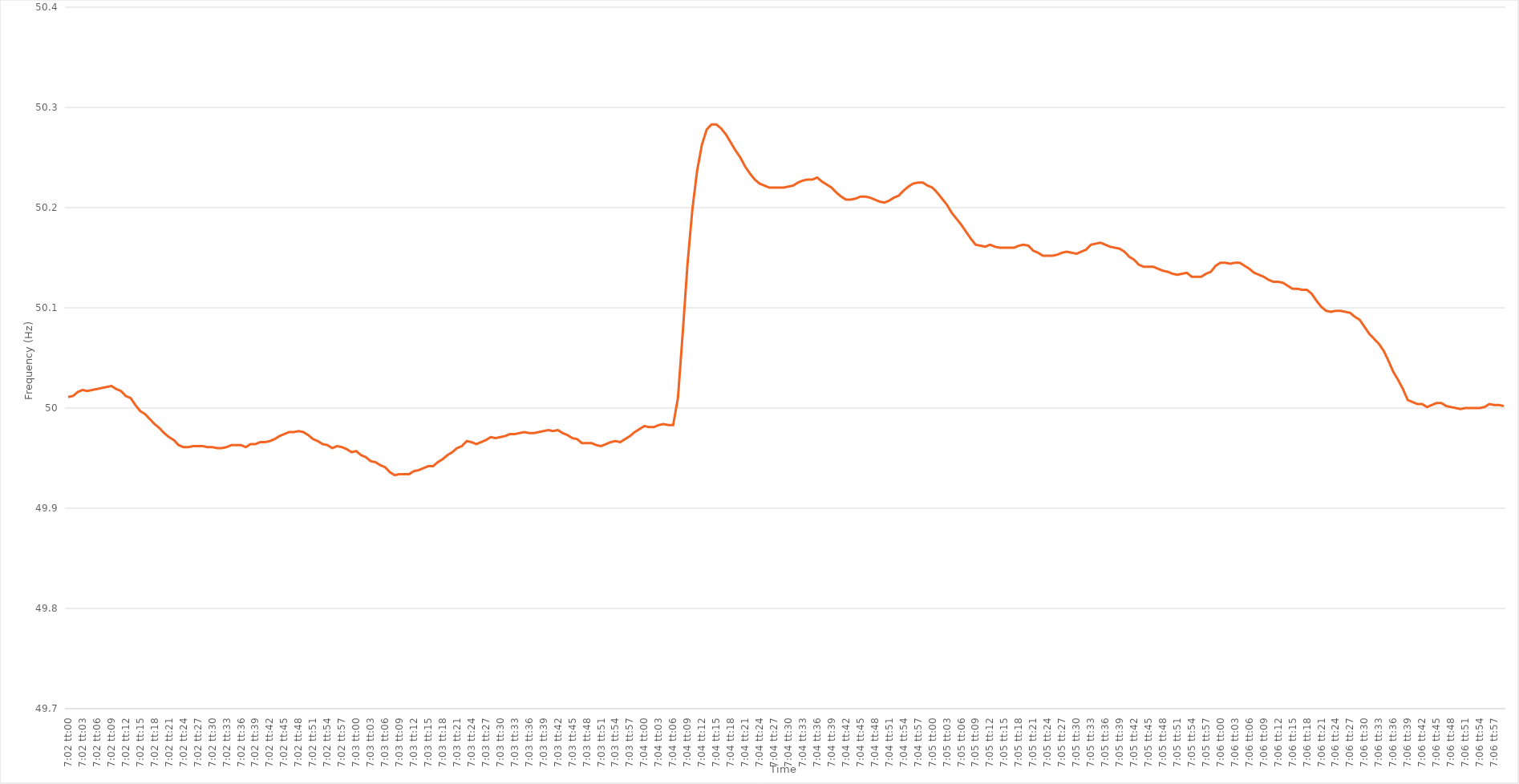
| Category | Series 0 |
|---|---|
| 0.29305555555555557 | 50.011 |
| 0.2930671296296296 | 50.012 |
| 0.2930787037037037 | 50.016 |
| 0.2930902777777778 | 50.018 |
| 0.29310185185185184 | 50.017 |
| 0.29311342592592593 | 50.018 |
| 0.293125 | 50.019 |
| 0.29313657407407406 | 50.02 |
| 0.29314814814814816 | 50.021 |
| 0.29315972222222225 | 50.022 |
| 0.2931712962962963 | 50.019 |
| 0.2931828703703704 | 50.017 |
| 0.2931944444444445 | 50.012 |
| 0.2932060185185185 | 50.01 |
| 0.29321759259259256 | 50.003 |
| 0.29322916666666665 | 49.997 |
| 0.29324074074074075 | 49.994 |
| 0.2932523148148148 | 49.989 |
| 0.2932638888888889 | 49.984 |
| 0.293275462962963 | 49.98 |
| 0.293287037037037 | 49.975 |
| 0.2932986111111111 | 49.971 |
| 0.2933101851851852 | 49.968 |
| 0.29332175925925924 | 49.963 |
| 0.29333333333333333 | 49.961 |
| 0.29334490740740743 | 49.961 |
| 0.29335648148148147 | 49.962 |
| 0.29336805555555556 | 49.962 |
| 0.29337962962962966 | 49.962 |
| 0.2933912037037037 | 49.961 |
| 0.2934027777777778 | 49.961 |
| 0.2934143518518519 | 49.96 |
| 0.2934259259259259 | 49.96 |
| 0.2934375 | 49.961 |
| 0.29344907407407406 | 49.963 |
| 0.29346064814814815 | 49.963 |
| 0.2934722222222222 | 49.963 |
| 0.2934837962962963 | 49.961 |
| 0.2934953703703704 | 49.964 |
| 0.2935069444444444 | 49.964 |
| 0.2935185185185185 | 49.966 |
| 0.2935300925925926 | 49.966 |
| 0.29354166666666665 | 49.967 |
| 0.29355324074074074 | 49.969 |
| 0.29356481481481483 | 49.972 |
| 0.2935763888888889 | 49.974 |
| 0.29358796296296297 | 49.976 |
| 0.29359953703703706 | 49.976 |
| 0.2936111111111111 | 49.977 |
| 0.2936226851851852 | 49.976 |
| 0.2936342592592593 | 49.973 |
| 0.29364583333333333 | 49.969 |
| 0.2936574074074074 | 49.967 |
| 0.2936689814814815 | 49.964 |
| 0.29368055555555556 | 49.963 |
| 0.2936921296296296 | 49.96 |
| 0.2937037037037037 | 49.962 |
| 0.2937152777777778 | 49.961 |
| 0.2937268518518518 | 49.959 |
| 0.2937384259259259 | 49.956 |
| 0.29375 | 49.957 |
| 0.29376157407407405 | 49.953 |
| 0.29377314814814814 | 49.951 |
| 0.29378472222222224 | 49.947 |
| 0.2937962962962963 | 49.946 |
| 0.29380787037037037 | 49.943 |
| 0.29381944444444447 | 49.941 |
| 0.2938310185185185 | 49.936 |
| 0.2938425925925926 | 49.933 |
| 0.2938541666666667 | 49.934 |
| 0.29386574074074073 | 49.934 |
| 0.2938773148148148 | 49.934 |
| 0.2938888888888889 | 49.937 |
| 0.29390046296296296 | 49.938 |
| 0.29391203703703705 | 49.94 |
| 0.2939236111111111 | 49.942 |
| 0.2939351851851852 | 49.942 |
| 0.2939467592592592 | 49.946 |
| 0.2939583333333333 | 49.949 |
| 0.2939699074074074 | 49.953 |
| 0.29398148148148145 | 49.956 |
| 0.29399305555555555 | 49.96 |
| 0.29400462962962964 | 49.962 |
| 0.2940162037037037 | 49.967 |
| 0.2940277777777778 | 49.966 |
| 0.29403935185185187 | 49.964 |
| 0.2940509259259259 | 49.966 |
| 0.2940625 | 49.968 |
| 0.2940740740740741 | 49.971 |
| 0.29408564814814814 | 49.97 |
| 0.29409722222222223 | 49.971 |
| 0.2941087962962963 | 49.972 |
| 0.29412037037037037 | 49.974 |
| 0.29413194444444446 | 49.974 |
| 0.29414351851851855 | 49.975 |
| 0.2941550925925926 | 49.976 |
| 0.29416666666666663 | 49.975 |
| 0.2941782407407407 | 49.975 |
| 0.2941898148148148 | 49.976 |
| 0.29420138888888886 | 49.977 |
| 0.29421296296296295 | 49.978 |
| 0.29422453703703705 | 49.977 |
| 0.2942361111111111 | 49.978 |
| 0.2942476851851852 | 49.975 |
| 0.2942592592592593 | 49.973 |
| 0.2942708333333333 | 49.97 |
| 0.2942824074074074 | 49.969 |
| 0.2942939814814815 | 49.965 |
| 0.29430555555555554 | 49.965 |
| 0.29431712962962964 | 49.965 |
| 0.29432870370370373 | 49.963 |
| 0.29434027777777777 | 49.962 |
| 0.29435185185185186 | 49.964 |
| 0.29436342592592596 | 49.966 |
| 0.294375 | 49.967 |
| 0.2943865740740741 | 49.966 |
| 0.29439814814814813 | 49.969 |
| 0.2944097222222222 | 49.972 |
| 0.29442129629629626 | 49.976 |
| 0.29443287037037036 | 49.979 |
| 0.29444444444444445 | 49.982 |
| 0.2944560185185185 | 49.981 |
| 0.2944675925925926 | 49.981 |
| 0.2944791666666667 | 49.983 |
| 0.2944907407407407 | 49.984 |
| 0.2945023148148148 | 49.983 |
| 0.2945138888888889 | 49.983 |
| 0.29452546296296295 | 50.01 |
| 0.29453703703703704 | 50.075 |
| 0.29454861111111114 | 50.144 |
| 0.2945601851851852 | 50.198 |
| 0.29457175925925927 | 50.237 |
| 0.29458333333333336 | 50.263 |
| 0.2945949074074074 | 50.278 |
| 0.2946064814814815 | 50.283 |
| 0.2946180555555556 | 50.283 |
| 0.29462962962962963 | 50.279 |
| 0.29464120370370367 | 50.273 |
| 0.29465277777777776 | 50.265 |
| 0.29466435185185186 | 50.257 |
| 0.2946759259259259 | 50.25 |
| 0.2946875 | 50.241 |
| 0.2946990740740741 | 50.234 |
| 0.2947106481481481 | 50.228 |
| 0.2947222222222222 | 50.224 |
| 0.2947337962962963 | 50.222 |
| 0.29474537037037035 | 50.22 |
| 0.29475694444444445 | 50.22 |
| 0.29476851851851854 | 50.22 |
| 0.2947800925925926 | 50.22 |
| 0.2947916666666667 | 50.221 |
| 0.29480324074074077 | 50.222 |
| 0.2948148148148148 | 50.225 |
| 0.2948263888888889 | 50.227 |
| 0.294837962962963 | 50.228 |
| 0.29484953703703703 | 50.228 |
| 0.2948611111111111 | 50.23 |
| 0.29487268518518517 | 50.226 |
| 0.29488425925925926 | 50.223 |
| 0.2948958333333333 | 50.22 |
| 0.2949074074074074 | 50.215 |
| 0.2949189814814815 | 50.211 |
| 0.29493055555555553 | 50.208 |
| 0.2949421296296296 | 50.208 |
| 0.2949537037037037 | 50.209 |
| 0.29496527777777776 | 50.211 |
| 0.29497685185185185 | 50.211 |
| 0.29498842592592595 | 50.21 |
| 0.295 | 50.208 |
| 0.2950115740740741 | 50.206 |
| 0.2950231481481482 | 50.205 |
| 0.2950347222222222 | 50.207 |
| 0.2950462962962963 | 50.21 |
| 0.2950578703703704 | 50.212 |
| 0.29506944444444444 | 50.217 |
| 0.29508101851851853 | 50.221 |
| 0.29509259259259263 | 50.224 |
| 0.29510416666666667 | 50.225 |
| 0.2951157407407407 | 50.225 |
| 0.2951273148148148 | 50.222 |
| 0.2951388888888889 | 50.22 |
| 0.29515046296296293 | 50.215 |
| 0.29516203703703703 | 50.209 |
| 0.2951736111111111 | 50.203 |
| 0.29518518518518516 | 50.195 |
| 0.29519675925925926 | 50.189 |
| 0.29520833333333335 | 50.183 |
| 0.2952199074074074 | 50.176 |
| 0.2952314814814815 | 50.169 |
| 0.2952430555555556 | 50.163 |
| 0.2952546296296296 | 50.162 |
| 0.2952662037037037 | 50.161 |
| 0.2952777777777778 | 50.163 |
| 0.29528935185185184 | 50.161 |
| 0.29530092592592594 | 50.16 |
| 0.29531250000000003 | 50.16 |
| 0.29532407407407407 | 50.16 |
| 0.29533564814814817 | 50.16 |
| 0.2953472222222222 | 50.162 |
| 0.2953587962962963 | 50.163 |
| 0.29537037037037034 | 50.162 |
| 0.29538194444444443 | 50.157 |
| 0.2953935185185185 | 50.155 |
| 0.29540509259259257 | 50.152 |
| 0.29541666666666666 | 50.152 |
| 0.29542824074074076 | 50.152 |
| 0.2954398148148148 | 50.153 |
| 0.2954513888888889 | 50.155 |
| 0.295462962962963 | 50.156 |
| 0.295474537037037 | 50.155 |
| 0.2954861111111111 | 50.154 |
| 0.2954976851851852 | 50.156 |
| 0.29550925925925925 | 50.158 |
| 0.29552083333333334 | 50.163 |
| 0.29553240740740744 | 50.164 |
| 0.2955439814814815 | 50.165 |
| 0.29555555555555557 | 50.163 |
| 0.29556712962962967 | 50.161 |
| 0.2955787037037037 | 50.16 |
| 0.29559027777777774 | 50.159 |
| 0.29560185185185184 | 50.156 |
| 0.29561342592592593 | 50.151 |
| 0.29562499999999997 | 50.148 |
| 0.29563657407407407 | 50.143 |
| 0.29564814814814816 | 50.141 |
| 0.2956597222222222 | 50.141 |
| 0.2956712962962963 | 50.141 |
| 0.2956828703703704 | 50.139 |
| 0.2956944444444444 | 50.137 |
| 0.2957060185185185 | 50.136 |
| 0.2957175925925926 | 50.134 |
| 0.29572916666666665 | 50.133 |
| 0.29574074074074075 | 50.134 |
| 0.29575231481481484 | 50.135 |
| 0.2957638888888889 | 50.131 |
| 0.295775462962963 | 50.131 |
| 0.29578703703703707 | 50.131 |
| 0.2957986111111111 | 50.134 |
| 0.29581018518518515 | 50.136 |
| 0.29582175925925924 | 50.142 |
| 0.29583333333333334 | 50.145 |
| 0.2958449074074074 | 50.145 |
| 0.29585648148148147 | 50.144 |
| 0.29586805555555556 | 50.145 |
| 0.2958796296296296 | 50.145 |
| 0.2958912037037037 | 50.142 |
| 0.2959027777777778 | 50.139 |
| 0.29591435185185183 | 50.135 |
| 0.2959259259259259 | 50.133 |
| 0.2959375 | 50.131 |
| 0.29594907407407406 | 50.128 |
| 0.29596064814814815 | 50.126 |
| 0.29597222222222225 | 50.126 |
| 0.2959837962962963 | 50.125 |
| 0.2959953703703704 | 50.122 |
| 0.2960069444444445 | 50.119 |
| 0.2960185185185185 | 50.119 |
| 0.2960300925925926 | 50.118 |
| 0.2960416666666667 | 50.118 |
| 0.29605324074074074 | 50.114 |
| 0.2960648148148148 | 50.107 |
| 0.2960763888888889 | 50.101 |
| 0.29608796296296297 | 50.097 |
| 0.296099537037037 | 50.096 |
| 0.2961111111111111 | 50.097 |
| 0.2961226851851852 | 50.097 |
| 0.29613425925925924 | 50.096 |
| 0.29614583333333333 | 50.095 |
| 0.2961574074074074 | 50.091 |
| 0.29616898148148146 | 50.088 |
| 0.29618055555555556 | 50.081 |
| 0.29619212962962965 | 50.074 |
| 0.2962037037037037 | 50.069 |
| 0.2962152777777778 | 50.064 |
| 0.2962268518518519 | 50.057 |
| 0.2962384259259259 | 50.047 |
| 0.29625 | 50.036 |
| 0.2962615740740741 | 50.028 |
| 0.29627314814814815 | 50.019 |
| 0.29628472222222224 | 50.008 |
| 0.2962962962962963 | 50.006 |
| 0.2963078703703704 | 50.004 |
| 0.2963194444444444 | 50.004 |
| 0.2963310185185185 | 50.001 |
| 0.2963425925925926 | 50.003 |
| 0.29635416666666664 | 50.005 |
| 0.29636574074074074 | 50.005 |
| 0.29637731481481483 | 50.002 |
| 0.29638888888888887 | 50.001 |
| 0.29640046296296296 | 50 |
| 0.29641203703703706 | 49.999 |
| 0.2964236111111111 | 50 |
| 0.2964351851851852 | 50 |
| 0.2964467592592593 | 50 |
| 0.2964583333333333 | 50 |
| 0.2964699074074074 | 50.001 |
| 0.2964814814814815 | 50.004 |
| 0.29649305555555555 | 50.003 |
| 0.29650462962962965 | 50.003 |
| 0.29651620370370374 | 50.002 |